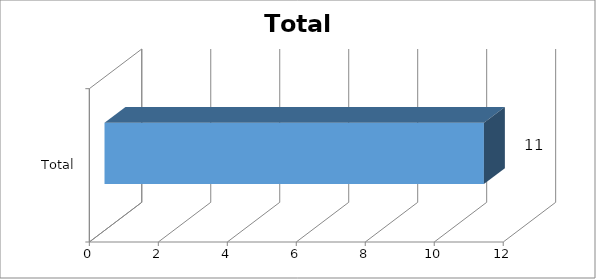
| Category | Total |
|---|---|
| Total | 11 |